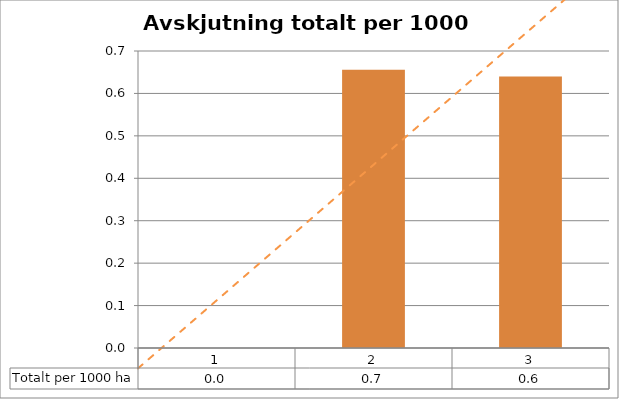
| Category | Totalt per 1000 ha |
|---|---|
| 0 | 0 |
| 1 | 0.656 |
| 2 | 0.64 |